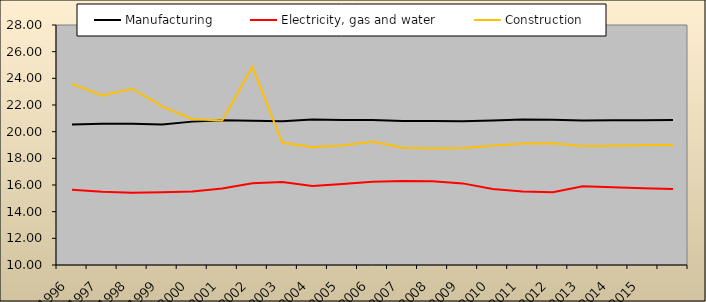
| Category | Manufacturing | Electricity, gas and water | Construction |
|---|---|---|---|
| 1996.0 | 20.532 | 15.65 | 23.584 |
| 1997.0 | 20.602 | 15.493 | 22.718 |
| 1998.0 | 20.592 | 15.425 | 23.218 |
| 1999.0 | 20.541 | 15.456 | 21.895 |
| 2000.0 | 20.753 | 15.506 | 20.932 |
| 2001.0 | 20.859 | 15.736 | 20.837 |
| 2002.0 | 20.821 | 16.132 | 24.864 |
| 2003.0 | 20.79 | 16.219 | 19.163 |
| 2004.0 | 20.917 | 15.918 | 18.846 |
| 2005.0 | 20.877 | 16.073 | 18.966 |
| 2006.0 | 20.87 | 16.25 | 19.26 |
| 2007.0 | 20.792 | 16.293 | 18.796 |
| 2008.0 | 20.806 | 16.28 | 18.734 |
| 2009.0 | 20.79 | 16.121 | 18.78 |
| 2010.0 | 20.841 | 15.707 | 18.945 |
| 2011.0 | 20.922 | 15.52 | 19.12 |
| 2012.0 | 20.894 | 15.463 | 19.135 |
| 2013.0 | 20.841 | 15.897 | 18.918 |
| 2014.0 | 20.849 | 15.831 | 18.939 |
| 2015.0 | 20.856 | 15.756 | 18.973 |